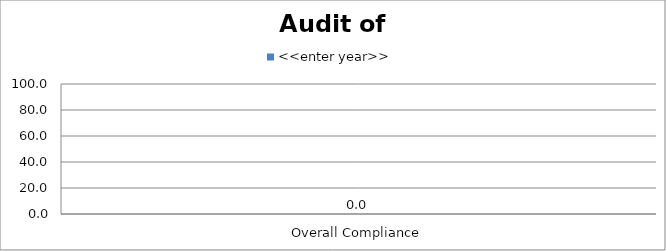
| Category | <<enter year>> |
|---|---|
| Overall Compliance | 0 |